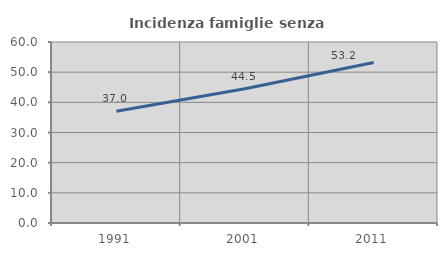
| Category | Incidenza famiglie senza nuclei |
|---|---|
| 1991.0 | 37.011 |
| 2001.0 | 44.52 |
| 2011.0 | 53.183 |